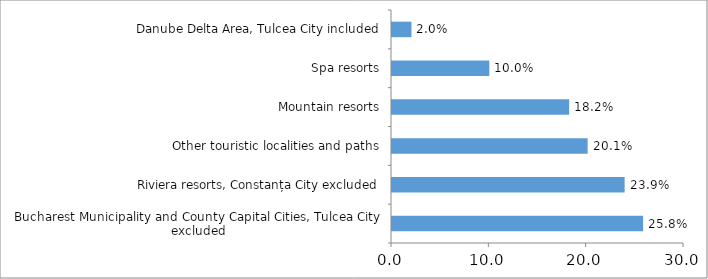
| Category | Tourist accommodation places |
|---|---|
| Bucharest Municipality and County Capital Cities, Tulcea City excluded | 25.8 |
| Riviera resorts, Constanța City excluded | 23.9 |
| Other touristic localities and paths | 20.1 |
| Mountain resorts | 18.2 |
| Spa resorts | 10 |
| Danube Delta Area, Tulcea City included | 2 |